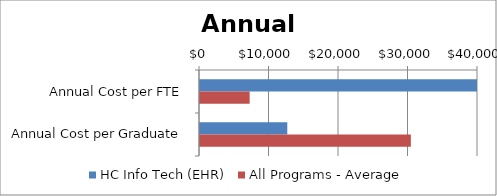
| Category | HC Info Tech (EHR) | All Programs - Average |
|---|---|---|
| Annual Cost per FTE | 313982.45 | 7144 |
| Annual Cost per Graduate | 12559.298 | 30340 |